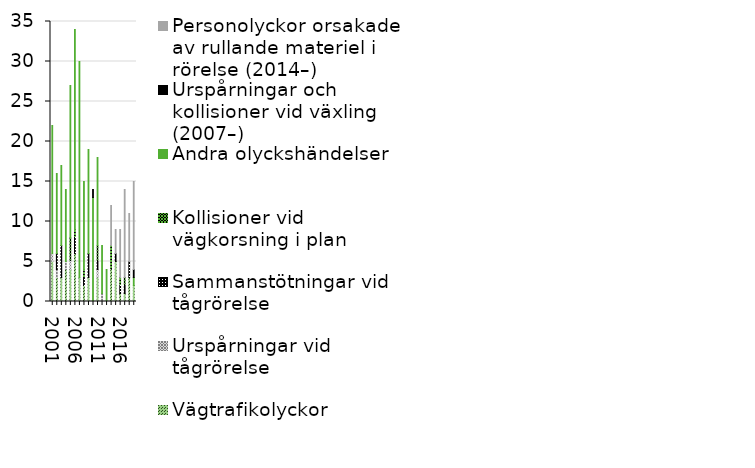
| Category | Vägtrafikolyckor | Urspårningar vid tågrörelse  | Sammanstötningar vid tågrörelse | Kollisioner vid vägkorsning i plan | Andra olyckshändelser | Urspårningar och kollisioner vid växling  (2007–) | Personolyckor orsakade av rullande materiel i rörelse (2014–) |
|---|---|---|---|---|---|---|---|
| 2001 | 5 | 1 | 0 | 0 | 16 | 0 | 0 |
| 2002 | 3 | 1 | 2 | 0 | 10 | 0 | 0 |
| 2003 | 3 | 0 | 4 | 0 | 10 | 0 | 0 |
| 2004 | 4 | 1 | 0 | 0 | 9 | 0 | 0 |
| 2005 | 4 | 1 | 0 | 3 | 19 | 0 | 0 |
| 2006 | 6 | 0 | 2 | 1 | 25 | 0 | 0 |
| 2007 | 3 | 0 | 0 | 0 | 27 | 0 | 0 |
| 2008 | 2 | 0 | 1 | 1 | 11 | 0 | 0 |
| 2009 | 3 | 0 | 3 | 0 | 13 | 0 | 0 |
| 2010 | 0 | 0 | 0 | 0 | 13 | 1 | 0 |
| 2011 | 3 | 1 | 1 | 2 | 11 | 0 | 0 |
| 2012 | 0 | 1 | 0 | 0 | 6 | 0 | 0 |
| 2013 | 0 | 0 | 0 | 0 | 4 | 0 | 0 |
| 2014 | 4 | 0 | 0 | 3 | 0 | 0 | 5 |
| 2015 | 5 | 0 | 1 | 0 | 0 | 0 | 3 |
| 2016 | 1 | 0 | 1 | 1 | 0 | 0 | 6 |
| 2017 | 1 | 0 | 1 | 1 | 0 | 0 | 11 |
| 2018 | 3 | 0 | 2 | 0 | 0 | 0 | 6 |
| 2019 | 2 | 0 | 0 | 0 | 1 | 1 | 11 |